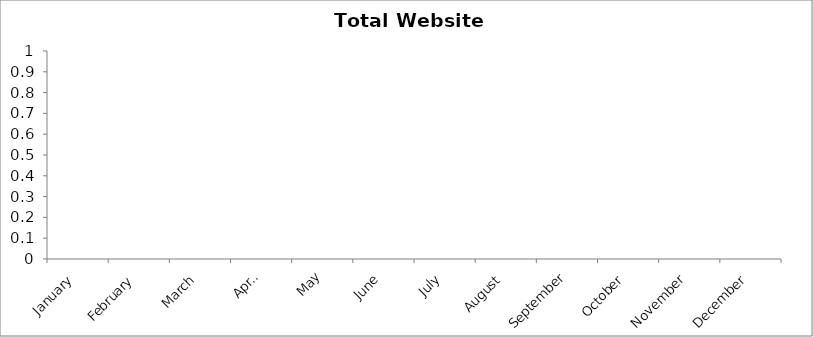
| Category | Total |
|---|---|
| January | 0 |
| February | 0 |
| March | 0 |
| April | 0 |
| May | 0 |
| June | 0 |
| July | 0 |
| August | 0 |
| September | 0 |
| October | 0 |
| November | 0 |
| December | 0 |